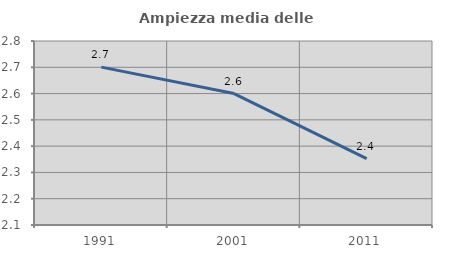
| Category | Ampiezza media delle famiglie |
|---|---|
| 1991.0 | 2.701 |
| 2001.0 | 2.6 |
| 2011.0 | 2.352 |